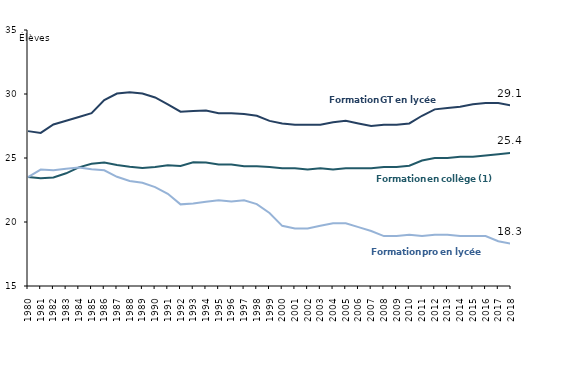
| Category | Formation en collège (1) | Formation pro en lycée | Formation GT en lycée |
|---|---|---|---|
| 1980.0 | 23.523 | 23.5 | 27.1 |
| 1981.0 | 23.423 | 24.099 | 26.961 |
| 1982.0 | 23.485 | 24.043 | 27.62 |
| 1983.0 | 23.805 | 24.165 | 27.908 |
| 1984.0 | 24.267 | 24.266 | 28.202 |
| 1985.0 | 24.546 | 24.121 | 28.5 |
| 1986.0 | 24.644 | 24.044 | 29.532 |
| 1987.0 | 24.462 | 23.532 | 30.038 |
| 1988.0 | 24.321 | 23.21 | 30.138 |
| 1989.0 | 24.221 | 23.066 | 30.038 |
| 1990.0 | 24.3 | 22.721 | 29.732 |
| 1991.0 | 24.441 | 22.199 | 29.196 |
| 1992.0 | 24.382 | 21.377 | 28.62 |
| 1993.0 | 24.662 | 21.444 | 28.667 |
| 1994.0 | 24.641 | 21.589 | 28.708 |
| 1995.0 | 24.5 | 21.7 | 28.5 |
| 1996.0 | 24.5 | 21.6 | 28.5 |
| 1997.0 | 24.362 | 21.7 | 28.431 |
| 1998.0 | 24.362 | 21.4 | 28.3 |
| 1999.0 | 24.3 | 20.7 | 27.9 |
| 2000.0 | 24.2 | 19.7 | 27.7 |
| 2001.0 | 24.2 | 19.5 | 27.6 |
| 2002.0 | 24.1 | 19.5 | 27.6 |
| 2003.0 | 24.2 | 19.7 | 27.6 |
| 2004.0 | 24.1 | 19.9 | 27.8 |
| 2005.0 | 24.2 | 19.9 | 27.9 |
| 2006.0 | 24.2 | 19.6 | 27.7 |
| 2007.0 | 24.2 | 19.3 | 27.5 |
| 2008.0 | 24.3 | 18.9 | 27.6 |
| 2009.0 | 24.3 | 18.9 | 27.6 |
| 2010.0 | 24.4 | 19 | 27.7 |
| 2011.0 | 24.8 | 18.9 | 28.3 |
| 2012.0 | 25 | 19 | 28.8 |
| 2013.0 | 25 | 19 | 28.9 |
| 2014.0 | 25.1 | 18.9 | 29 |
| 2015.0 | 25.1 | 18.9 | 29.2 |
| 2016.0 | 25.2 | 18.9 | 29.3 |
| 2017.0 | 25.3 | 18.5 | 29.3 |
| 2018.0 | 25.4 | 18.3 | 29.1 |